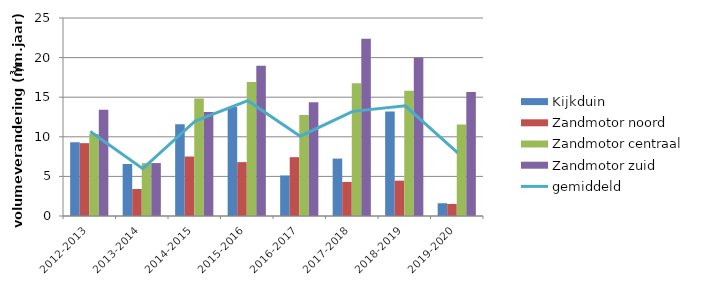
| Category | Kijkduin | Zandmotor noord | Zandmotor centraal | Zandmotor zuid |
|---|---|---|---|---|
| 2012-2013 | 9.311 | 9.198 | 10.356 | 13.43 |
| 2013-2014 | 6.563 | 3.407 | 6.676 | 6.681 |
| 2014-2015 | 11.573 | 7.507 | 14.83 | 13.131 |
| 2015-2016 | 13.771 | 6.801 | 16.919 | 18.977 |
| 2016-2017 | 5.116 | 7.427 | 12.745 | 14.373 |
| 2017-2018 | 7.248 | 4.304 | 16.748 | 22.391 |
| 2018-2019 | 13.192 | 4.465 | 15.801 | 20.009 |
| 2019-2020 | 1.61 | 1.524 | 11.558 | 15.667 |